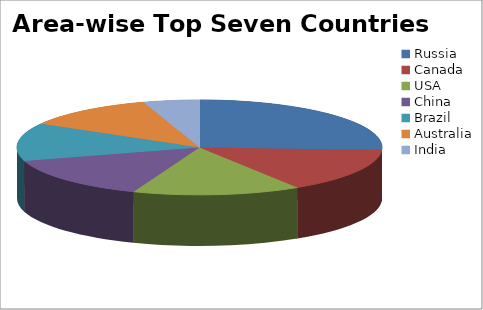
| Category | Series 0 |
|---|---|
| Russia | 17098242 |
| Canada | 9984670 |
| USA | 9826675 |
| China | 9596961 |
| Brazil | 8514877 |
| Australia | 7741220 |
| India | 3287263 |